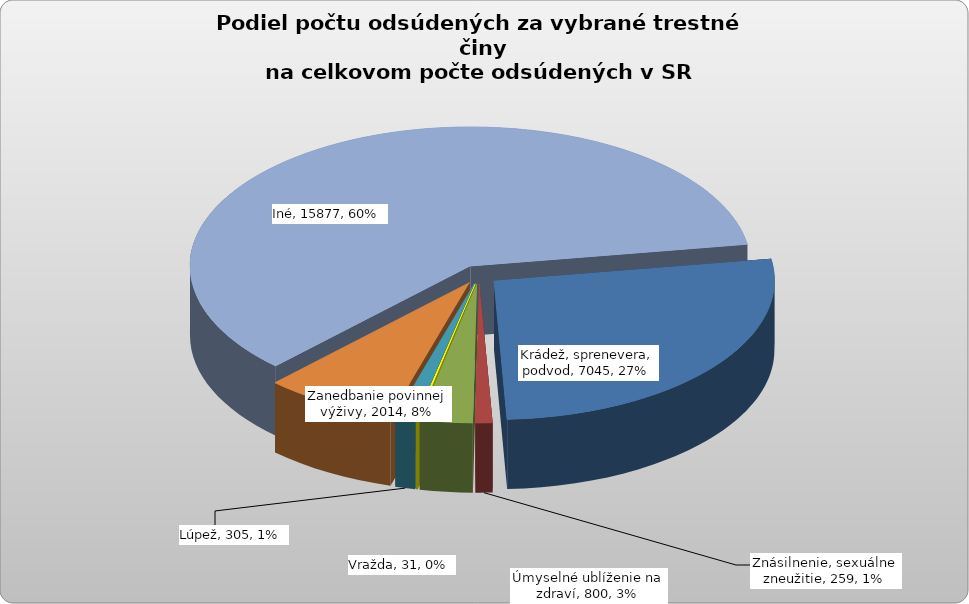
| Category | Series 0 |
|---|---|
| Krádež, sprenevera, podvod | 7045 |
| Znásilnenie, sexuálne zneužitie | 259 |
| Úmyselné ublíženie na zdraví | 800 |
| Vražda | 31 |
| Lúpež | 305 |
| Zanedbanie povinnej výživy | 2014 |
| Iné | 15877 |